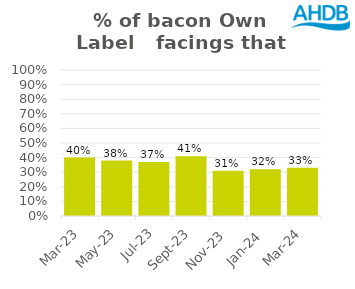
| Category | Bacon |
|---|---|
| 2023-03-01 | 0.4 |
| 2023-05-01 | 0.38 |
| 2023-07-01 | 0.37 |
| 2023-09-01 | 0.41 |
| 2023-11-01 | 0.31 |
| 2024-01-01 | 0.32 |
| 2024-03-01 | 0.33 |